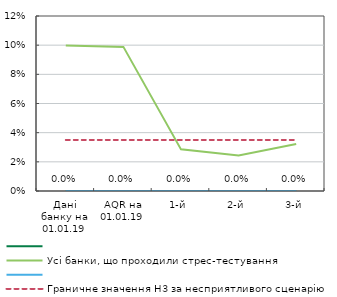
| Category | Series 0 | Усі банки, що проходили стрес-тестування | Series 3 | Граничне значення Н3 за несприятливого сценарію |
|---|---|---|---|---|
| Дані банку на 01.01.19 | 0 | 0.1 | 0 | 0.035 |
| AQR на 01.01.19 | 0 | 0.099 | 0 | 0.035 |
| 1-й | 0 | 0.029 | 0 | 0.035 |
| 2-й | 0 | 0.024 | 0 | 0.035 |
| 3-й | 0 | 0.032 | 0 | 0.035 |